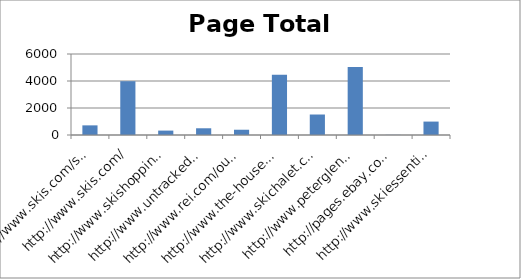
| Category | Total Links |
|---|---|
| http://www.skis.com/ski-equipment/c9/ | 714 |
| http://www.skis.com/ | 3985 |
| http://www.skishoppingguide.com/ | 326 |
| http://www.untracked.com/ | 498 |
| http://www.rei.com/outlet/category/22000078 | 390 |
| http://www.the-house.com/skis.html | 4464 |
| http://www.skichalet.com/ | 1518 |
| http://www.peterglenn.com/ | 5040 |
| http://pages.ebay.com/buy/guides/skis-skiing-equipment-buying-guide/ | 11 |
| http://www.skiessentials.com/ | 994 |